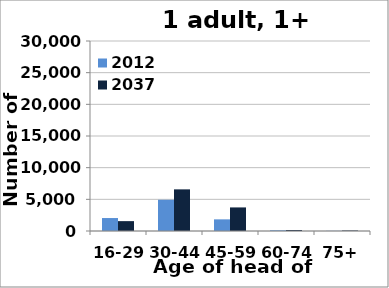
| Category | 2012 | 2037 |
|---|---|---|
| 16-29 | 2046 | 1558 |
| 30-44 | 4932 | 6574 |
| 45-59 | 1837 | 3723 |
| 60-74 | 109 | 158 |
| 75+ | 26 | 80 |